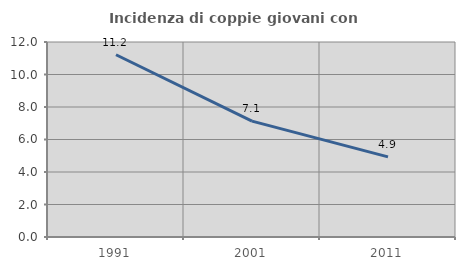
| Category | Incidenza di coppie giovani con figli |
|---|---|
| 1991.0 | 11.216 |
| 2001.0 | 7.131 |
| 2011.0 | 4.932 |